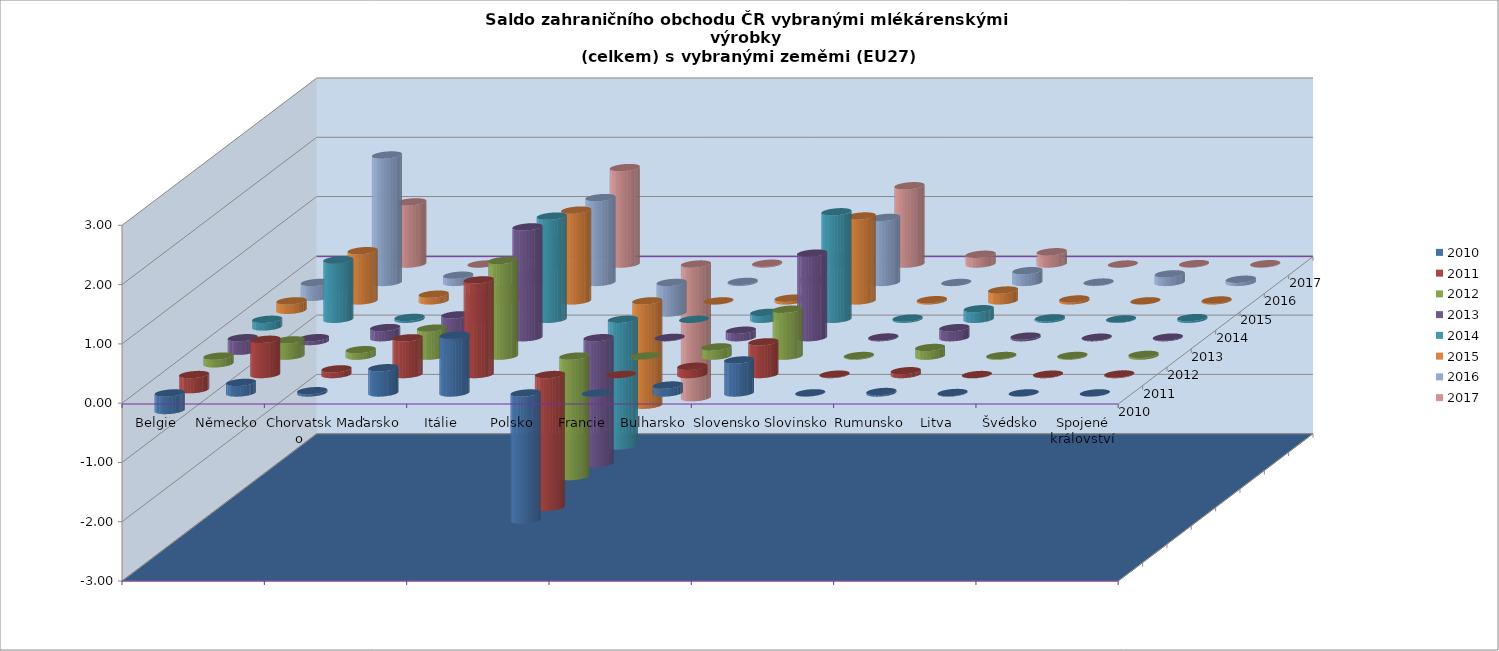
| Category | 2010 | 2011 | 2012 | 2013 | 2014 | 2015 | 2016 | 2017 |
|---|---|---|---|---|---|---|---|---|
| Belgie | -295539 | -255120 | -129707 | -227574 | -128990 | -159086 | -249940 | -397780 |
| Německo | 178338 | 594866 | 273940 | -63919 | 1003137 | 846928 | 2150641 | 1049074 |
| Chorvatsko | 38102 | 95940 | 109290 | 170932 | 31714 | 113134 | 122668 | 0 |
| Maďarsko | 425362 | 619554 | 472302 | 385774 | 389700 | 211568 | 164711 | 394757 |
| Itálie | 975839 | 1596654 | 1614212 | 1869509 | 1739916 | 1530757 | 1431068 | 1627122 |
| Polsko | -2142497 | -2238657 | -2031128 | -2123111 | -2134538 | -1760959 | -515006 | -2254777 |
| Francie | -7897 | 2837 | 5374 | 6090 | -1123 | -2493 | 17859 | 13855 |
| Bulharsko | 134187 | 139774 | 156138 | 126522 | 116839 | 44883 | 64712 | 117519 |
| Slovensko | 556240 | 551760 | 791535 | 1426982 | 1813688 | 1431945 | 1097291 | 1320770 |
| Slovinsko | 2377 | 6294 | 10726 | 11935 | 19882 | 19894 | 0 | 164652 |
| Rumunsko | 24312 | 64290 | 145966 | 169186 | 178392 | 182956 | 199214 | 207281 |
| Litva  | 7397 | -1948 | 10308 | 27002 | 23864 | 32062 | 6743 | 0 |
| Švédsko | 1431 | 6146 | 11485 | 8512 | 6866 | 1095 | 145202 | 7144 |
| Spojené království | 1595 | 9523 | 29559 | 10472 | 28641 | 14999 | 53837 | 5719 |